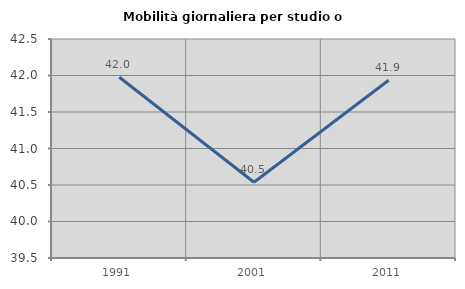
| Category | Mobilità giornaliera per studio o lavoro |
|---|---|
| 1991.0 | 41.975 |
| 2001.0 | 40.538 |
| 2011.0 | 41.935 |